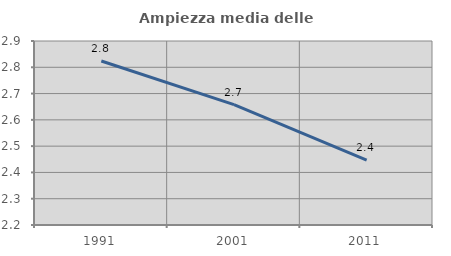
| Category | Ampiezza media delle famiglie |
|---|---|
| 1991.0 | 2.824 |
| 2001.0 | 2.658 |
| 2011.0 | 2.447 |